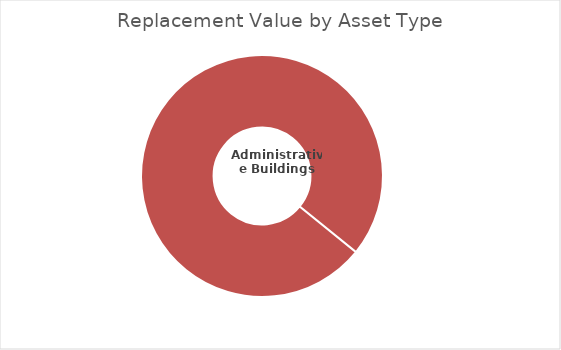
| Category | Series 1 |
|---|---|
| Administrative Buildings | 3981000 |
| Library | 0 |
| Fire Hall | 0 |
| Public Works Maintenance Shop | 0 |
| Garage & Fuel Facilities | 0 |
| Storage Sheds | 0 |
| IT Infrastructure | 0 |
| Cemetery Facilities | 0 |